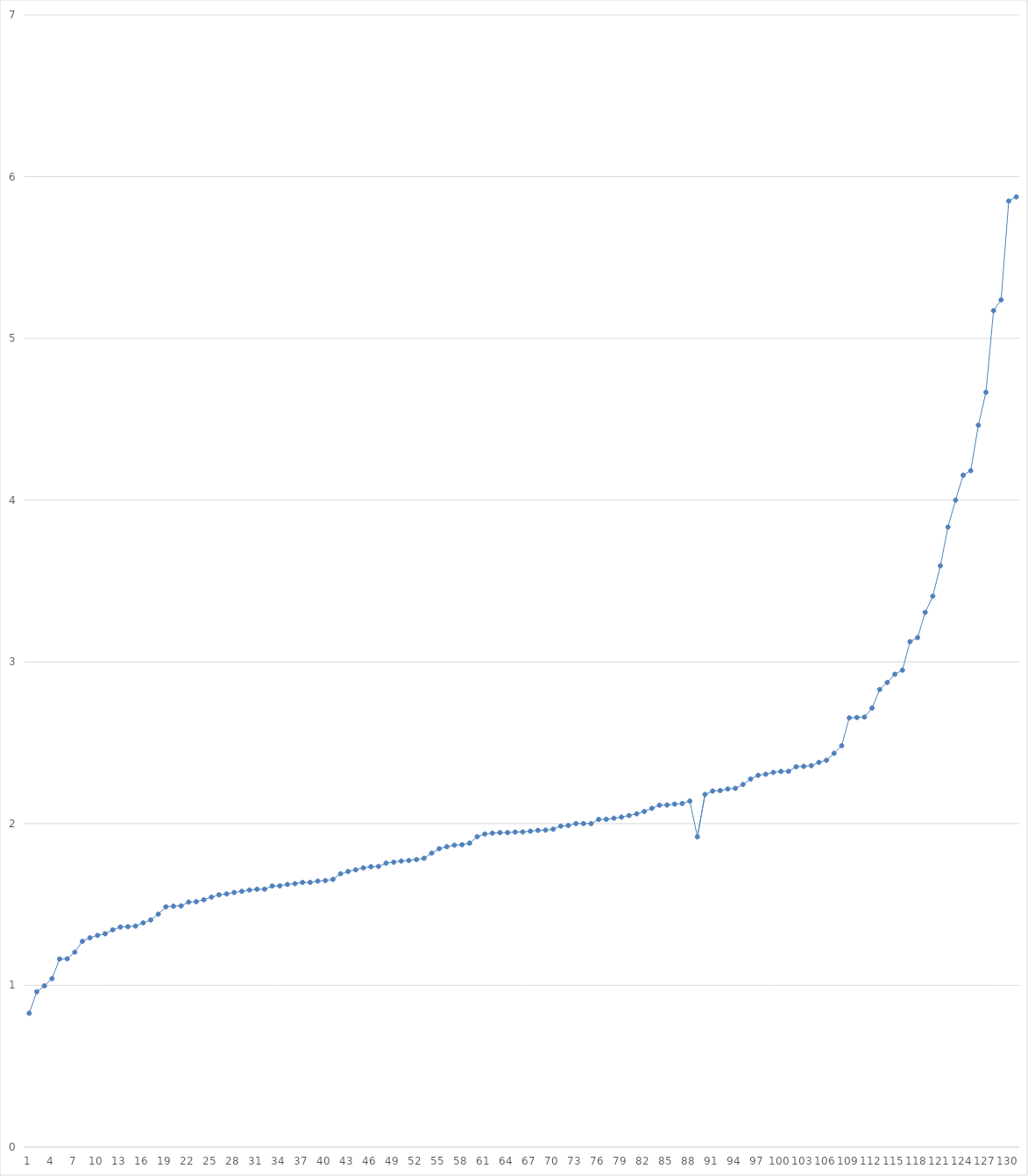
| Category | Series 0 |
|---|---|
| 0 | 0.828 |
| 1 | 0.96 |
| 2 | 0.997 |
| 3 | 1.042 |
| 4 | 1.163 |
| 5 | 1.164 |
| 6 | 1.205 |
| 7 | 1.272 |
| 8 | 1.294 |
| 9 | 1.309 |
| 10 | 1.319 |
| 11 | 1.343 |
| 12 | 1.36 |
| 13 | 1.363 |
| 14 | 1.367 |
| 15 | 1.386 |
| 16 | 1.404 |
| 17 | 1.44 |
| 18 | 1.485 |
| 19 | 1.489 |
| 20 | 1.491 |
| 21 | 1.515 |
| 22 | 1.517 |
| 23 | 1.529 |
| 24 | 1.545 |
| 25 | 1.56 |
| 26 | 1.565 |
| 27 | 1.574 |
| 28 | 1.581 |
| 29 | 1.589 |
| 30 | 1.594 |
| 31 | 1.595 |
| 32 | 1.614 |
| 33 | 1.615 |
| 34 | 1.624 |
| 35 | 1.629 |
| 36 | 1.636 |
| 37 | 1.636 |
| 38 | 1.644 |
| 39 | 1.648 |
| 40 | 1.655 |
| 41 | 1.689 |
| 42 | 1.704 |
| 43 | 1.714 |
| 44 | 1.726 |
| 45 | 1.733 |
| 46 | 1.735 |
| 47 | 1.756 |
| 48 | 1.761 |
| 49 | 1.768 |
| 50 | 1.772 |
| 51 | 1.778 |
| 52 | 1.786 |
| 53 | 1.817 |
| 54 | 1.845 |
| 55 | 1.857 |
| 56 | 1.867 |
| 57 | 1.87 |
| 58 | 1.879 |
| 59 | 1.919 |
| 60 | 1.935 |
| 61 | 1.941 |
| 62 | 1.944 |
| 63 | 1.944 |
| 64 | 1.948 |
| 65 | 1.948 |
| 66 | 1.953 |
| 67 | 1.958 |
| 68 | 1.959 |
| 69 | 1.966 |
| 70 | 1.985 |
| 71 | 1.988 |
| 72 | 2 |
| 73 | 2 |
| 74 | 2 |
| 75 | 2.026 |
| 76 | 2.026 |
| 77 | 2.033 |
| 78 | 2.04 |
| 79 | 2.05 |
| 80 | 2.061 |
| 81 | 2.075 |
| 82 | 2.095 |
| 83 | 2.114 |
| 84 | 2.115 |
| 85 | 2.121 |
| 86 | 2.124 |
| 87 | 2.139 |
| 88 | 1.918 |
| 89 | 2.181 |
| 90 | 2.201 |
| 91 | 2.204 |
| 92 | 2.214 |
| 93 | 2.218 |
| 94 | 2.242 |
| 95 | 2.275 |
| 96 | 2.299 |
| 97 | 2.305 |
| 98 | 2.317 |
| 99 | 2.323 |
| 100 | 2.323 |
| 101 | 2.352 |
| 102 | 2.354 |
| 103 | 2.358 |
| 104 | 2.378 |
| 105 | 2.392 |
| 106 | 2.435 |
| 107 | 2.481 |
| 108 | 2.654 |
| 109 | 2.656 |
| 110 | 2.659 |
| 111 | 2.714 |
| 112 | 2.829 |
| 113 | 2.873 |
| 114 | 2.923 |
| 115 | 2.949 |
| 116 | 3.125 |
| 117 | 3.15 |
| 118 | 3.306 |
| 119 | 3.406 |
| 120 | 3.594 |
| 121 | 3.833 |
| 122 | 4 |
| 123 | 4.154 |
| 124 | 4.182 |
| 125 | 4.463 |
| 126 | 4.667 |
| 127 | 5.171 |
| 128 | 5.238 |
| 129 | 5.849 |
| 130 | 5.875 |